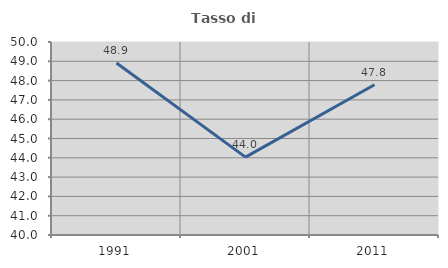
| Category | Tasso di occupazione   |
|---|---|
| 1991.0 | 48.909 |
| 2001.0 | 44.037 |
| 2011.0 | 47.788 |